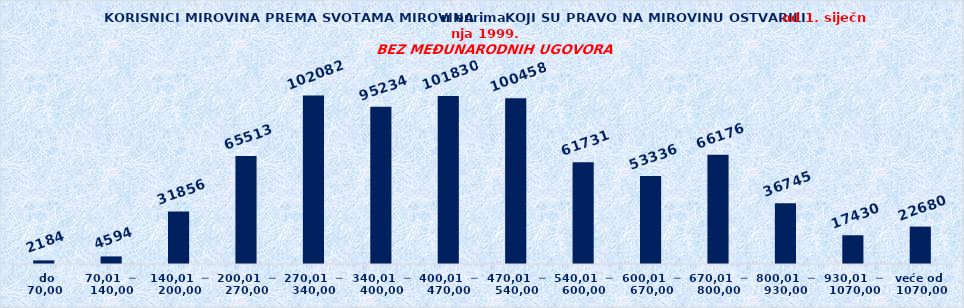
| Category | Series 0 |
|---|---|
|   do  70,00 | 2184 |
| 70,01  ─  140,00 | 4594 |
| 140,01  ─  200,00 | 31856 |
| 200,01  ─  270,00 | 65513 |
| 270,01  ─  340,00 | 102082 |
| 340,01  ─  400,00 | 95234 |
| 400,01  ─  470,00 | 101830 |
| 470,01  ─  540,00 | 100458 |
| 540,01  ─  600,00 | 61731 |
| 600,01  ─  670,00 | 53336 |
| 670,01  ─  800,00 | 66176 |
| 800,01  ─  930,00 | 36745 |
| 930,01  ─  1070,00 | 17430 |
| veće od  1070,00 | 22680 |